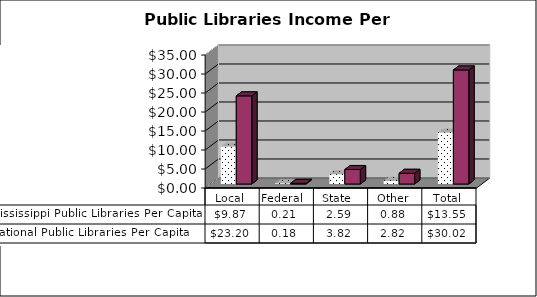
| Category | Mississippi Public Libraries Per Capita | National Public Libraries Per Capita |
|---|---|---|
| Local | 9.87 | 23.2 |
| Federal  | 0.21 | 0.18 |
| State  | 2.59 | 3.82 |
| Other | 0.88 | 2.82 |
| Total | 13.55 | 30.02 |